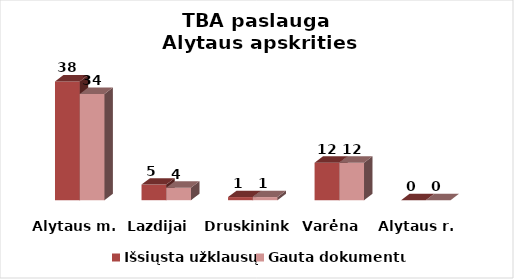
| Category | Išsiųsta užklausų | Gauta dokumentų |
|---|---|---|
| Alytaus m. | 38 | 34 |
| Lazdijai | 5 | 4 |
| Druskininkai | 1 | 1 |
| Varėna | 12 | 12 |
| Alytaus r. | 0 | 0 |